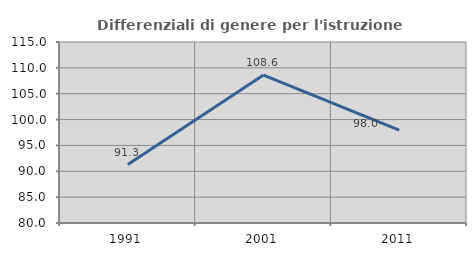
| Category | Differenziali di genere per l'istruzione superiore |
|---|---|
| 1991.0 | 91.3 |
| 2001.0 | 108.606 |
| 2011.0 | 97.962 |